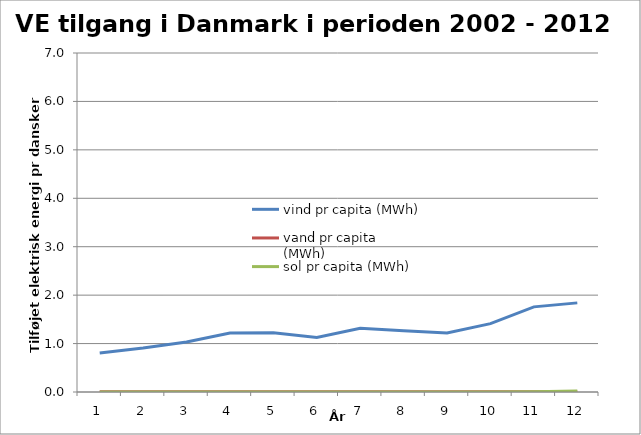
| Category | vind pr capita (MWh) | vand pr capita (MWh) | sol pr capita (MWh) |
|---|---|---|---|
| 0 | 0.805 | 0.005 | 0 |
| 1 | 0.908 | 0.006 | 0 |
| 2 | 1.033 | 0.004 | 0 |
| 3 | 1.22 | 0.005 | 0 |
| 4 | 1.222 | 0.004 | 0 |
| 5 | 1.125 | 0.004 | 0 |
| 6 | 1.316 | 0.005 | 0 |
| 7 | 1.265 | 0.005 | 0.001 |
| 8 | 1.219 | 0.003 | 0.001 |
| 9 | 1.411 | 0.004 | 0.001 |
| 10 | 1.758 | 0.003 | 0.003 |
| 11 | 1.84 | 0.003 | 0.019 |